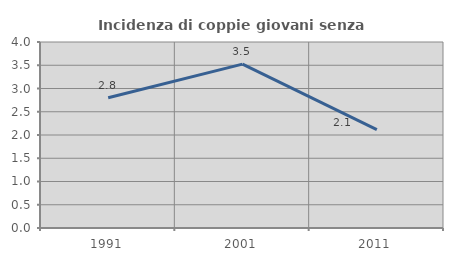
| Category | Incidenza di coppie giovani senza figli |
|---|---|
| 1991.0 | 2.802 |
| 2001.0 | 3.524 |
| 2011.0 | 2.118 |